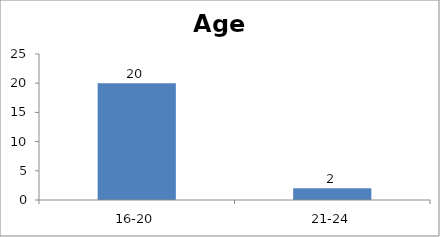
| Category | Age |
|---|---|
| 16-20 | 20 |
| 21-24 | 2 |